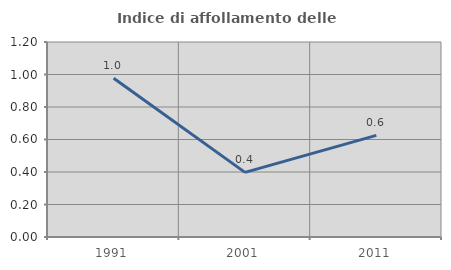
| Category | Indice di affollamento delle abitazioni  |
|---|---|
| 1991.0 | 0.977 |
| 2001.0 | 0.398 |
| 2011.0 | 0.626 |